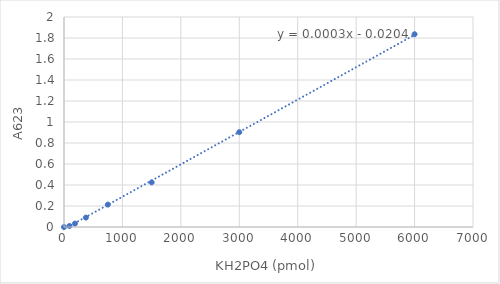
| Category | Series 0 |
|---|---|
| 0.0 | 0 |
| 93.75 | 0.01 |
| 187.5 | 0.033 |
| 375.0 | 0.09 |
| 750.0 | 0.213 |
| 1500.0 | 0.425 |
| 3000.0 | 0.903 |
| 6000.0 | 1.836 |